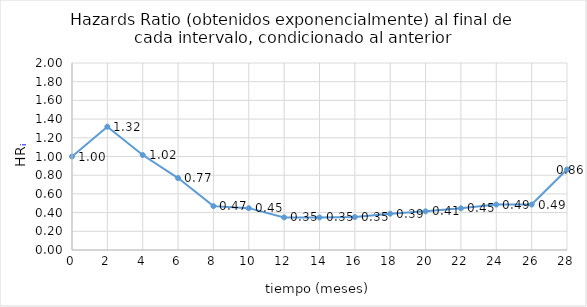
| Category | Series 0 |
|---|---|
| 0.0 | 1 |
| 2.0 | 1.319 |
| 4.0 | 1.016 |
| 6.0 | 0.769 |
| 8.0 | 0.469 |
| 10.0 | 0.448 |
| 12.0 | 0.349 |
| 14.0 | 0.348 |
| 16.0 | 0.352 |
| 18.0 | 0.388 |
| 20.0 | 0.413 |
| 22.0 | 0.446 |
| 24.0 | 0.486 |
| 26.0 | 0.486 |
| 28.0 | 0.86 |